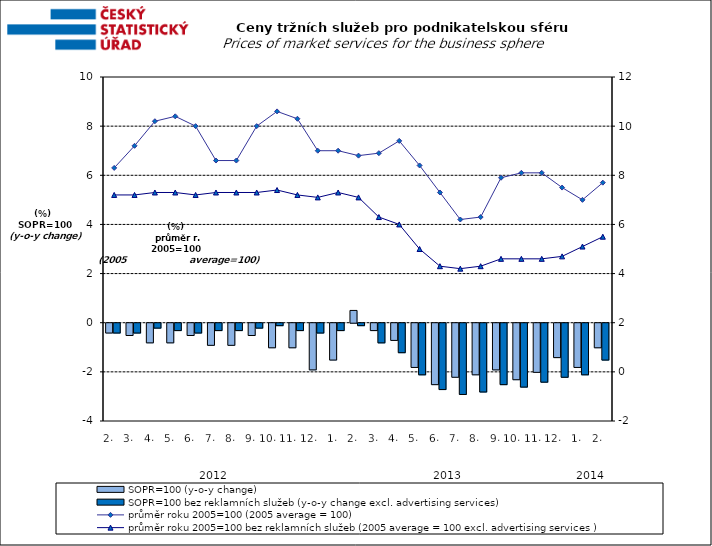
| Category | SOPR=100 (y-o-y change)   | SOPR=100 bez reklamních služeb (y-o-y change excl. advertising services)   |
|---|---|---|
| 0 | -0.4 | -0.4 |
| 1 | -0.5 | -0.4 |
| 2 | -0.8 | -0.2 |
| 3 | -0.8 | -0.3 |
| 4 | -0.5 | -0.4 |
| 5 | -0.9 | -0.3 |
| 6 | -0.9 | -0.3 |
| 7 | -0.5 | -0.2 |
| 8 | -1 | -0.1 |
| 9 | -1 | -0.3 |
| 10 | -1.9 | -0.4 |
| 11 | -1.5 | -0.3 |
| 12 | 0.5 | -0.1 |
| 13 | -0.3 | -0.8 |
| 14 | -0.7 | -1.2 |
| 15 | -1.8 | -2.1 |
| 16 | -2.5 | -2.7 |
| 17 | -2.2 | -2.9 |
| 18 | -2.1 | -2.8 |
| 19 | -1.9 | -2.5 |
| 20 | -2.3 | -2.6 |
| 21 | -2 | -2.4 |
| 22 | -1.4 | -2.2 |
| 23 | -1.8 | -2.1 |
| 24 | -1 | -1.5 |